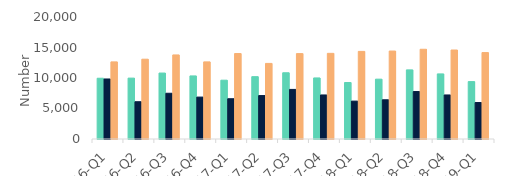
| Category | First-time
buyers | Homemovers | Homowner remortgaging |
|---|---|---|---|
| 16-Q1 | 9960 | 9840 | 12640 |
| 16-Q2 | 9980 | 6110 | 13080 |
| 16-Q3 | 10810 | 7500 | 13780 |
| 16-Q4 | 10340 | 6870 | 12640 |
| 17-Q1 | 9640 | 6600 | 14010 |
| 17-Q2 | 10220 | 7120 | 12390 |
| 17-Q3 | 10860 | 8130 | 14000 |
| 17-Q4 | 10010 | 7220 | 14040 |
| 18-Q1 | 9260 | 6210 | 14360 |
| 18-Q2 | 9810 | 6430 | 14420 |
| 18-Q3 | 11330 | 7780 | 14710 |
| 18-Q4 | 10670 | 7220 | 14590 |
| 19-Q1 | 9410 | 5980 | 14170 |